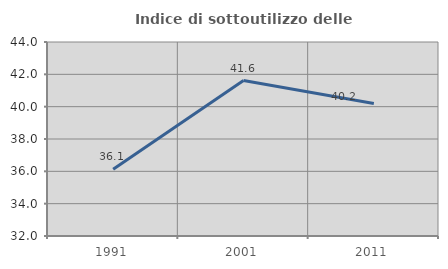
| Category | Indice di sottoutilizzo delle abitazioni  |
|---|---|
| 1991.0 | 36.129 |
| 2001.0 | 41.615 |
| 2011.0 | 40.196 |